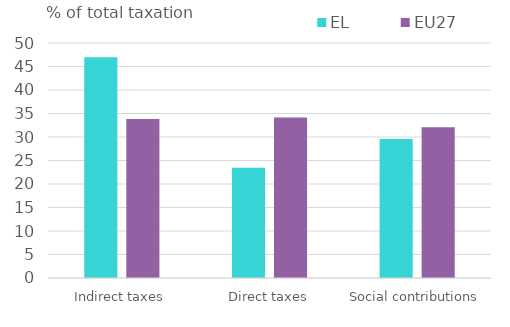
| Category | EL | EU27 |
|---|---|---|
| Indirect taxes | 46.981 | 33.811 |
| Direct taxes | 23.441 | 34.133 |
| Social contributions | 29.577 | 32.056 |